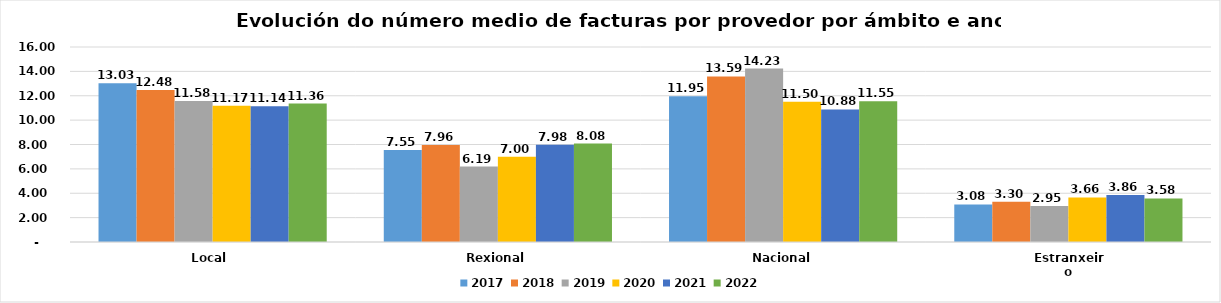
| Category | 2017 | 2018 | 2019 | 2020 | 2021 | 2022 |
|---|---|---|---|---|---|---|
| Local  | 13.026 | 12.478 | 11.575 | 11.173 | 11.14 | 11.357 |
| Rexional | 7.554 | 7.958 | 6.186 | 7 | 7.98 | 8.076 |
| Nacional | 11.953 | 13.589 | 14.229 | 11.504 | 10.88 | 11.549 |
| Estranxeiro | 3.08 | 3.3 | 2.946 | 3.658 | 3.86 | 3.576 |